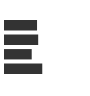
| Category | Series 0 |
|---|---|
| 0 | 0.396 |
| 1 | 0.41 |
| 2 | 0.33 |
| 3 | 0.46 |